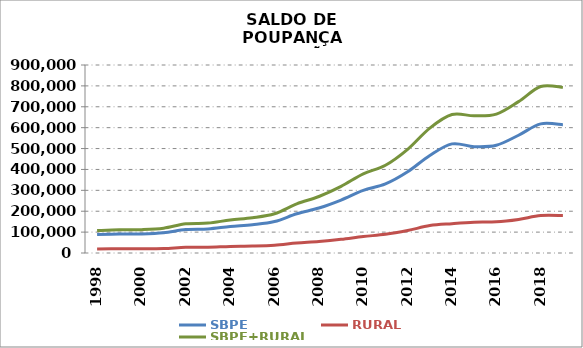
| Category | SBPE | RURAL | SBPE+RURAL |
|---|---|---|---|
| 1998 | 88538.349 | 18883.24 | 107421.589 |
| 1999 | 90437.74 | 20294.123 | 110731.863 |
| 2000 | 91430.45 | 20310.891 | 111741.341 |
| 2001 | 97146.25 | 21552.598 | 118698.848 |
| 2002 | 112423.444 | 27219.068 | 139642.512 |
| 2003 | 115258.021 | 27799.406 | 143057.427 |
| 2004 | 126853.217 | 31413.354 | 158266.571 |
| 2005 | 135411.681 | 33322.74 | 168734.421 |
| 2006 | 150412.546 | 37523.193 | 187935.739 |
| 2007 | 187827.264 | 47434.388 | 235261.652 |
| 2008 | 215400.282 | 54995.458 | 270395.74 |
| 2009 | 253604.98 | 65477.998 | 319082.978 |
| 2010 | 299878.217 | 78920.574 | 378798.791 |
| 2011 | 330569.272 | 89439.722 | 420008.994 |
| 2012 | 388641.662 | 107660.772 | 496302.434 |
| 2013 | 466788.644 | 131154.416 | 597943.06 |
| 2014 | 522343.501 | 140383.609 | 662727.11 |
| 2015 | 509223.044 | 147366.727 | 656589.771 |
| 2016 | 515955.43 | 149036.994 | 664992.424 |
| 2017 | 563741.675 | 160861.771 | 724603.446 |
| 2018 | 618146.063 | 179134.939 | 797281.002 |
| 2019* | 613839.163 | 179051.574 | 792890.737 |